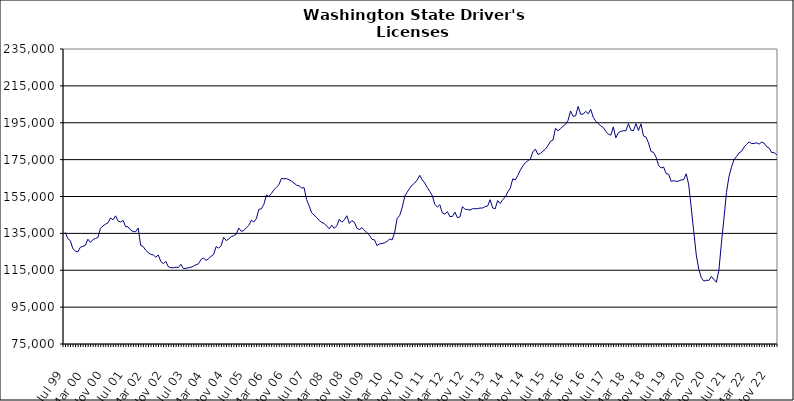
| Category | Series 0 |
|---|---|
| Jul 99 | 135560 |
| Aug 99 | 132182 |
| Sep 99 | 131104 |
| Oct 99 | 126694 |
| Nov 99 | 125425 |
| Dec 99 | 124927 |
| Jan 00 | 127499 |
| Feb 00 | 127927 |
| Mar 00 | 128547 |
| Apr 00 | 131834 |
| May 00 | 130120 |
| Jun 00 | 131595 |
| Jul 00 | 132236 |
| Aug 00 | 132819 |
| Sep 00 | 137711 |
| Oct 00 | 139063 |
| Nov 00 | 139952 |
| Dec 00 | 140732 |
| Jan 01 | 143338 |
| Feb 01 | 142359 |
| Mar 01 | 144523 |
| Apr 01 | 141758 |
| May 01 | 141135 |
| Jun 01 | 142064 |
| Jul 01 | 138646 |
| Aug 01 | 138530 |
| Sep 01 | 136784 |
| Oct 01 | 135996 |
| Nov 01 | 135917 |
| Dec 01 | 137940 |
| Jan 02 | 128531 |
| Feb 02 | 127848 |
| Mar 02 | 125876 |
| Apr 02 | 124595 |
| May 02 | 123660 |
| Jun 02 | 123282 |
| Jul 02 | 122089 |
| Aug 02 | 123279 |
| Sep 02 | 119727 |
| Oct 02 | 118588 |
| Nov 02 | 119854 |
| Dec 02 | 116851 |
| Jan 03 | 116407 |
| Feb 03 | 116382 |
| Mar 03 | 116648 |
| Apr 03 | 116471 |
| May 03 | 118231 |
| Jun 03 | 115831 |
| Jul 03 | 116082 |
| Aug 03 | 116341 |
| Sep 03 | 116653 |
| Oct 03 | 117212 |
| Nov 03 | 117962 |
| Dec 03 | 118542 |
| Jan 04 | 120817 |
| Feb 04 | 121617 |
| Mar 04 | 120369 |
| Apr 04 | 121200 |
| May 04 | 122609 |
| Jun 04 | 123484 |
| Jul 04 | 127844 |
| Aug 04 | 127025 |
| Sep 04 | 128273 |
| Oct 04 | 132853 |
| Nov 04 | 131106 |
| Dec 04 | 131935 |
| Jan 05 | 133205 |
| Feb 05 | 133736 |
| Mar 05 | 134528 |
| Apr 05 | 137889 |
| May 05 | 136130 |
| Jun 05 | 136523 |
| Jul 05 | 137997 |
| Aug 05 | 139294 |
| Sep 05 | 142140 |
| Oct 05 | 141192 |
| Nov 05 | 142937 |
| Dec 05 | 148013 |
| Jan 06 | 148341 |
| Feb 06 | 150744 |
| Mar 06 | 155794 |
| Apr 06 | 154984 |
| May 06 | 156651 |
| Jun 06 | 158638 |
| Jul 06 | 159911 |
| Aug 06 | 161445 |
| Sep 06 | 164852 |
| Oct 06 | 164570 |
| Nov 06 | 164679 |
| Dec 06 | 164127 |
| Jan 07 | 163271 |
| Feb 07 | 162273 |
| Mar 07 | 161140 |
| Apr 07 | 160860 |
| May 07 | 159633 |
| Jun 07 | 159724 |
| Jul 07 | 153303 |
| Aug 07 | 149939 |
| Sep 07 | 146172 |
| Oct 07 | 144876 |
| Nov 07 | 143613 |
| Dec 07 | 142022 |
| Jan 08 | 140909 |
| Feb 08 | 140368 |
| Mar 08 | 138998 |
| Apr 08 | 137471 |
| May 08 | 139453 |
| Jun 08 | 137680 |
| Jul 08 | 139120 |
| Aug 08 | 142612 |
| Sep-08 | 141071 |
| Oct 08 | 142313 |
| Nov 08 | 144556 |
| Dec 08 | 140394 |
| Jan 09 | 141903 |
| Feb 09 | 141036 |
| Mar 09 | 137751 |
| Apr 09 | 137060 |
| May 09 | 138101 |
| Jun 09 | 136739 |
| Jul 09 | 135317 |
| Aug 09 | 134020 |
| Sep 09 | 131756 |
| Oct 09 | 131488 |
| Nov 09 | 128370 |
| Dec 09 | 129323 |
| Jan 10 | 129531 |
| Feb 10 | 129848 |
| Mar 10 | 130654 |
| Apr 10 | 131929 |
| May 10 | 131429 |
| Jun 10 | 135357 |
| Jul 10 | 143032 |
| Aug 10 | 144686 |
| Sep 10 | 148856 |
| Oct 10 | 155042 |
| Nov 10 | 157328 |
| Dec 10 | 159501 |
| Jan 11 | 161221 |
| Feb 11 | 162312 |
| Mar 11 | 163996 |
| Apr 11 | 166495 |
| May 11 | 164040 |
| Jun 11 | 162324 |
| Jul 11 | 159862 |
| Aug 11 | 157738 |
| Sep 11 | 155430 |
| Oct 11 | 150762 |
| Nov 11 | 149255 |
| Dec 11 | 150533 |
| Jan 12 | 146068 |
| Feb 12 | 145446 |
| Mar 12 | 146788 |
| Apr 12 | 144110 |
| May 12 | 144162 |
| Jun 12 | 146482 |
| Jul 12 | 143445 |
| Aug 12 | 143950 |
| Sep 12 | 149520 |
| Oct 12 | 148033 |
| Nov 12 | 147926 |
| Dec 12 | 147674 |
| Jan 13 | 148360 |
| Feb-13 | 148388 |
| Mar-13 | 148414 |
| Apr 13 | 148749 |
| May 13 | 148735 |
| Jun-13 | 149521 |
| Jul 13 | 149837 |
| Aug 13 | 153252 |
| Sep 13 | 148803 |
| Oct 13 | 148315 |
| Nov 13 | 152804 |
| Dec 13 | 151209 |
| Jan 14 | 153357 |
| Feb-14 | 154608 |
| Mar 14 | 157479 |
| Apr 14 | 159441 |
| May 14 | 164591 |
| Jun 14 | 163995 |
| Jul-14 | 166411 |
| Aug-14 | 169272 |
| Sep 14 | 171565 |
| Oct 14 | 173335 |
| Nov 14 | 174406 |
| Dec 14 | 175302 |
| Jan 15 | 179204 |
| Feb 15 | 180737 |
| Mar 15 | 177810 |
| Apr-15 | 178331 |
| May 15 | 179601 |
| Jun-15 | 180729 |
| Jul 15 | 182540 |
| Aug 15 | 184924 |
| Sep 15 | 185620 |
| Oct 15 | 192002 |
| Nov 15 | 190681 |
| Dec 15 | 191795 |
| Jan 16 | 193132 |
| Feb 16 | 194206 |
| Mar 16 | 196319 |
| Apr 16 | 201373 |
| May 16 | 198500 |
| Jun 16 | 198743 |
| Jul 16 | 203841 |
| Aug 16 | 199630 |
| Sep 16 | 199655 |
| Oct 16 | 201181 |
| Nov 16 | 199888 |
| Dec 16 | 202304 |
| Jan 17 | 197977 |
| Feb 17 | 195889 |
| Mar 17 | 194438 |
| Apr 17 | 193335 |
| May 17 | 192430 |
| Jun 17 | 190298 |
| Jul 17 | 188832 |
| Aug 17 | 188264 |
| Sep 17 | 192738 |
| Oct 17 | 186856 |
| Nov 17 | 189537 |
| Dec 17 | 190341 |
| Jan 18 | 190670 |
| Feb 18 | 190645 |
| Mar 18 | 194476 |
| Apr 18 | 190971 |
| May 18 | 190707 |
| Jun 18 | 194516 |
| Jul 18 | 190783 |
| Aug 18 | 194390 |
| Sep 18 | 187831 |
| Oct 18 | 187188 |
| Nov 18 | 184054 |
| Dec 18 | 179347 |
| Jan 19 | 178958 |
| Feb 19 | 176289 |
| Mar 19 | 171747 |
| Apr 19 | 170532 |
| May 19 | 170967 |
| Jun 19 | 167444 |
| Jul 19 | 167059 |
| Aug 19 | 163194 |
| Sep 19 | 163599 |
| Oct 19 | 163212 |
| Nov 19 | 163388 |
| Dec 19 | 164024 |
| Jan 20 | 164114 |
| Feb 20 | 167320 |
| Mar 20 | 161221 |
| Apr 20 | 148866 |
| May 20 | 135821 |
| Jun 20 | 123252 |
| Jul 20 | 115526 |
| Aug 20 | 110940 |
| Sep 20 | 109099 |
| Oct 20 | 109566 |
| Nov 20 | 109488 |
| Dec 20 | 111658 |
| Jan 21 | 110070 |
| Feb 21 | 108491 |
| Mar 21 | 115176 |
| Apr 21 | 129726 |
| May 21 | 143052 |
| Jun 21 | 157253 |
| Jul 21 | 165832 |
| Aug 21 | 170937 |
| Sep 21 | 175042 |
| Oct 21 | 176696 |
| Nov 21 | 178677 |
| Dec 21 | 179501 |
| Jan 22 | 181825 |
| Feb 22 | 183258 |
| Mar 22 | 184618 |
| Apr 22 | 183710 |
| May 22 | 183784 |
| Jun 22 | 184101 |
| Jul 22 | 183443 |
| Aug 22 | 184475 |
| Sep 22 | 183902 |
| Oct 22 | 181994 |
| Nov 22 | 181207 |
| Dec 22 | 178793 |
| Jan 23 | 178782 |
| Feb 23 | 177647 |